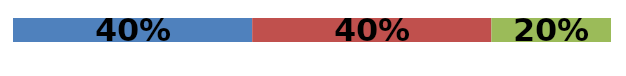
| Category | Series 0 | Series 1 | Series 2 |
|---|---|---|---|
| 0 | 0.4 | 0.4 | 0.2 |